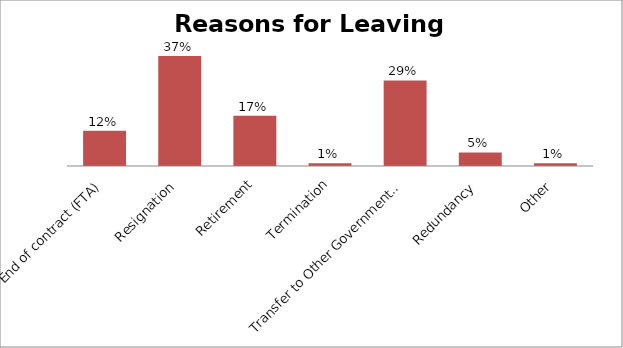
| Category | Leaving Reason |
|---|---|
| End of contract (FTA) | 0.118 |
| Resignation | 0.367 |
| Retirement | 0.167 |
| Termination | 0.009 |
| Transfer to Other Government Department  | 0.285 |
| Redundancy | 0.045 |
| Other | 0.009 |